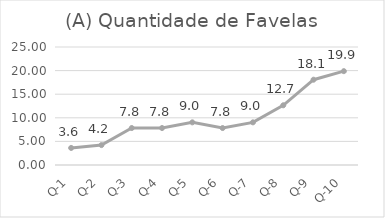
| Category | FAVELA(S/N) |
|---|---|
| Q-1 | 3.614 |
| Q-2 | 4.217 |
| Q-3 | 7.831 |
| Q-4 | 7.831 |
| Q-5 | 9.036 |
| Q-6 | 7.831 |
| Q-7 | 9.036 |
| Q-8 | 12.651 |
| Q-9 | 18.072 |
| Q-10 | 19.88 |